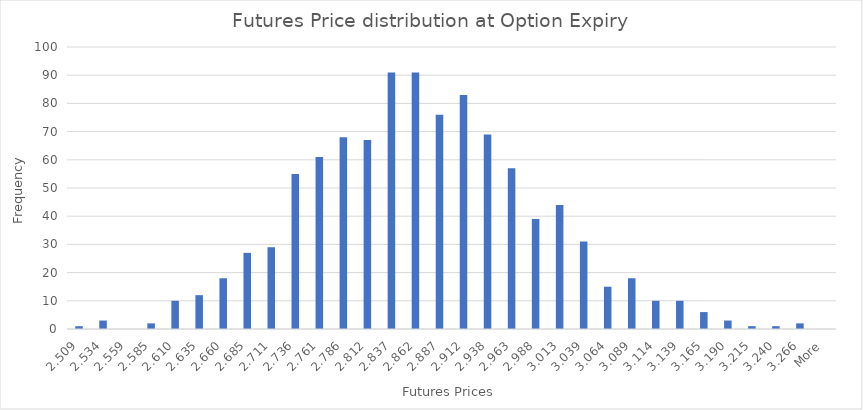
| Category | Frequency |
|---|---|
| 2.509 | 1 |
| 2.534 | 3 |
| 2.559 | 0 |
| 2.585 | 2 |
| 2.610 | 10 |
| 2.635 | 12 |
| 2.660 | 18 |
| 2.685 | 27 |
| 2.711 | 29 |
| 2.736 | 55 |
| 2.761 | 61 |
| 2.786 | 68 |
| 2.812 | 67 |
| 2.837 | 91 |
| 2.862 | 91 |
| 2.887 | 76 |
| 2.912 | 83 |
| 2.938 | 69 |
| 2.963 | 57 |
| 2.988 | 39 |
| 3.013 | 44 |
| 3.039 | 31 |
| 3.064 | 15 |
| 3.089 | 18 |
| 3.114 | 10 |
| 3.139 | 10 |
| 3.165 | 6 |
| 3.190 | 3 |
| 3.215 | 1 |
| 3.240 | 1 |
| 3.266 | 2 |
| More | 0 |